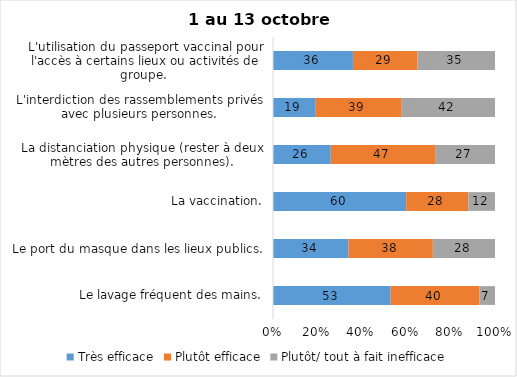
| Category | Très efficace | Plutôt efficace | Plutôt/ tout à fait inefficace |
|---|---|---|---|
| Le lavage fréquent des mains. | 53 | 40 | 7 |
| Le port du masque dans les lieux publics. | 34 | 38 | 28 |
| La vaccination. | 60 | 28 | 12 |
| La distanciation physique (rester à deux mètres des autres personnes). | 26 | 47 | 27 |
| L'interdiction des rassemblements privés avec plusieurs personnes. | 19 | 39 | 42 |
| L'utilisation du passeport vaccinal pour l'accès à certains lieux ou activités de groupe.  | 36 | 29 | 35 |